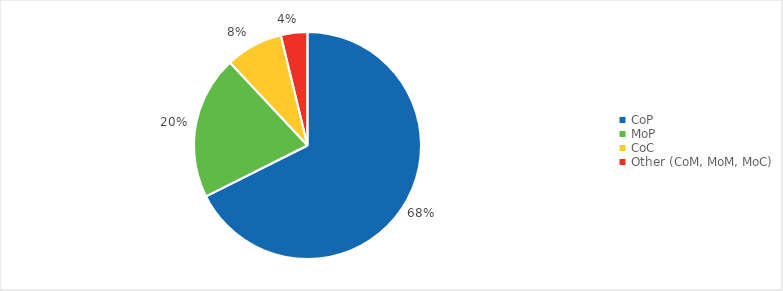
| Category | Series 0 |
|---|---|
| CoP | 0.676 |
| MoP | 0.204 |
| CoC | 0.082 |
| Other (CoM, MoM, MoC) | 0.038 |